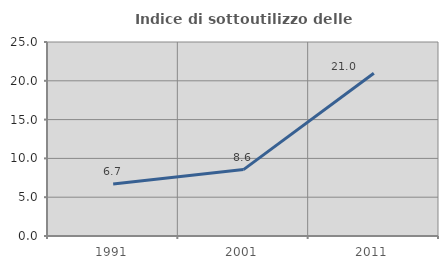
| Category | Indice di sottoutilizzo delle abitazioni  |
|---|---|
| 1991.0 | 6.696 |
| 2001.0 | 8.557 |
| 2011.0 | 20.967 |